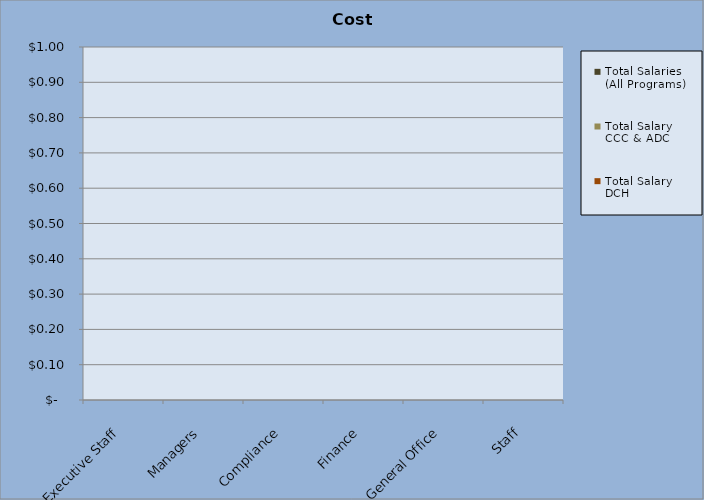
| Category | Total Salaries
(All Programs) | Total Salary
CCC & ADC | Total Salary
DCH |
|---|---|---|---|
| Executive Staff | 0 | 0 | 0 |
| Managers | 0 | 0 | 0 |
| Compliance | 0 | 0 | 0 |
| Finance | 0 | 0 | 0 |
| General Office | 0 | 0 | 0 |
| Staff | 0 | 0 | 0 |